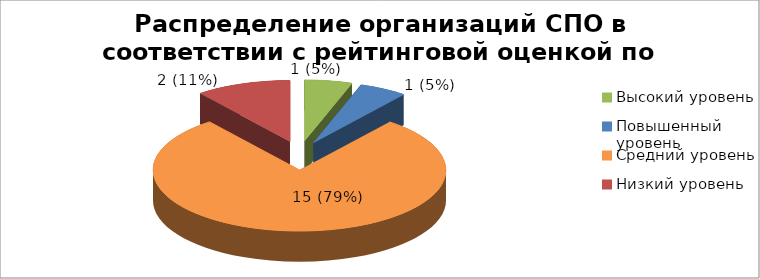
| Category | Series 8 | Series 9 |
|---|---|---|
| Высокий уровень | 0.053 |  |
| Повышенный уровень | 0.053 |  |
| Средний уровень | 0.789 |  |
| Низкий уровень | 0.105 |  |